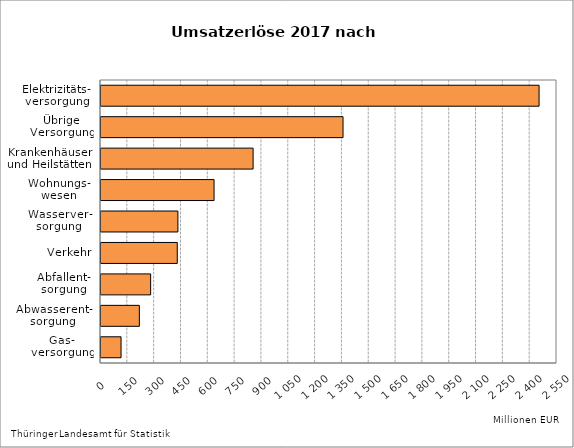
| Category | Series 1 |
|---|---|
| Gas-
versorgung | 112.151 |
| Abwasserent-
sorgung | 214.447 |
| Abfallent-
sorgung | 277.597 |
| Verkehr | 426.572 |
| Wasserver-
sorgung | 429.994 |
| Wohnungs-
wesen | 632.297 |
| Krankenhäuser
und Heilstätten | 850.65 |
| Übrige
Versorgung | 1353.493 |
| Elektrizitäts-
versorgung | 2449.82 |